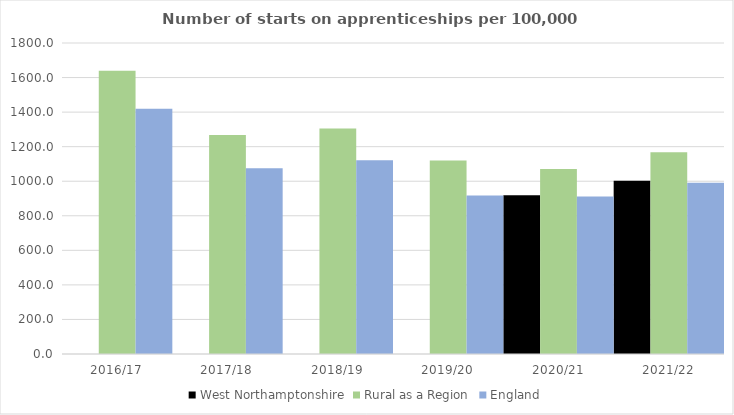
| Category | West Northamptonshire | Rural as a Region | England |
|---|---|---|---|
| 2016/17 | 0 | 1638.789 | 1420 |
| 2017/18 | 0 | 1267.474 | 1075 |
| 2018/19 | 0 | 1304.57 | 1122 |
| 2019/20 | 0 | 1119.662 | 918 |
| 2020/21 | 919 | 1070.748 | 912 |
| 2021/22 | 1003 | 1167.68 | 991 |